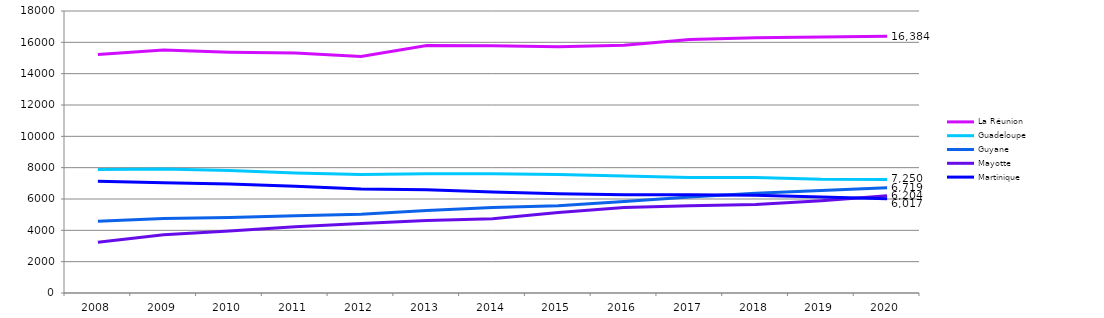
| Category | La Réunion | Guadeloupe | Guyane | Mayotte | Martinique |
|---|---|---|---|---|---|
| 2008.0 | 15229 | 7890 | 4577 | 3233 | 7132 |
| 2009.0 | 15511 | 7922 | 4748 | 3714 | 7036 |
| 2010.0 | 15369 | 7819 | 4814 | 3955 | 6953 |
| 2011.0 | 15313 | 7667 | 4935 | 4225 | 6810 |
| 2012.0 | 15092 | 7563 | 5030 | 4433 | 6631 |
| 2013.0 | 15797 | 7613 | 5267 | 4621 | 6589 |
| 2014.0 | 15788 | 7612 | 5459 | 4742 | 6441 |
| 2015.0 | 15712 | 7559 | 5562 | 5140 | 6341 |
| 2016.0 | 15810 | 7473 | 5835 | 5461 | 6277 |
| 2017.0 | 16173 | 7365 | 6131 | 5576 | 6274 |
| 2018.0 | 16286 | 7370 | 6367 | 5644 | 6233 |
| 2019.0 | 16333 | 7262 | 6540 | 5892 | 6128 |
| 2020.0 | 16384 | 7250 | 6719 | 6204 | 6017 |